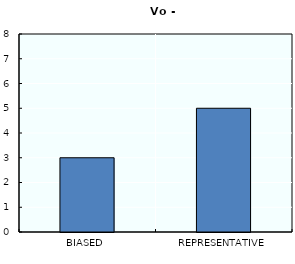
| Category | Series 0 |
|---|---|
| BIASED | 3 |
| REPRESENTATIVE | 5 |